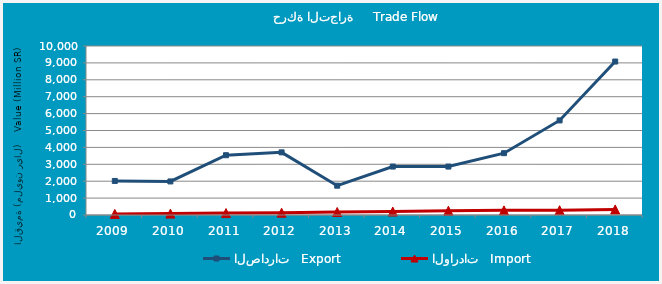
| Category | الصادرات   Export | الواردات   Import |
|---|---|---|
| 2009.0 | 2014898659 | 63434323 |
| 2010.0 | 1986501619 | 82389430 |
| 2011.0 | 3536494804 | 114259731 |
| 2012.0 | 3707114445 | 136962983 |
| 2013.0 | 1733775342 | 178412424 |
| 2014.0 | 2867004134 | 205463722 |
| 2015.0 | 2865686887 | 253778032 |
| 2016.0 | 3657943759 | 274869956 |
| 2017.0 | 5596564386 | 284413527 |
| 2018.0 | 9080778345 | 329574083 |